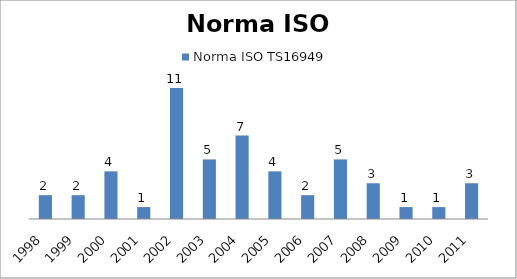
| Category | Norma ISO TS16949 |
|---|---|
| 1998.0 | 2 |
| 1999.0 | 2 |
| 2000.0 | 4 |
| 2001.0 | 1 |
| 2002.0 | 11 |
| 2003.0 | 5 |
| 2004.0 | 7 |
| 2005.0 | 4 |
| 2006.0 | 2 |
| 2007.0 | 5 |
| 2008.0 | 3 |
| 2009.0 | 1 |
| 2010.0 | 1 |
| 2011.0 | 3 |